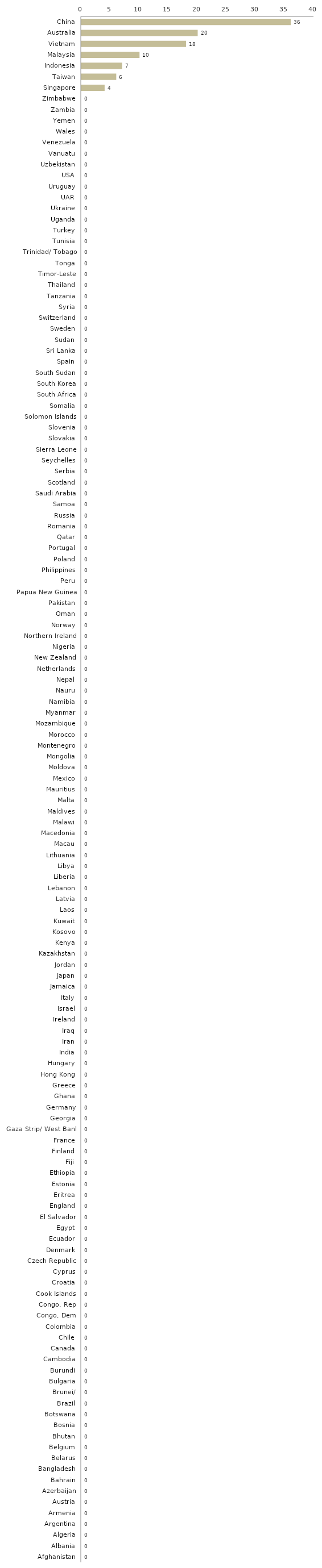
| Category | Series 0 |
|---|---|
| China | 36 |
| Australia | 20 |
| Vietnam | 18 |
| Malaysia | 10 |
| Indonesia | 7 |
| Taiwan | 6 |
| Singapore | 4 |
| Zimbabwe | 0 |
| Zambia | 0 |
| Yemen | 0 |
| Wales | 0 |
| Venezuela | 0 |
| Vanuatu | 0 |
| Uzbekistan | 0 |
| USA | 0 |
| Uruguay | 0 |
| UAR | 0 |
| Ukraine | 0 |
| Uganda | 0 |
| Turkey | 0 |
| Tunisia | 0 |
| Trinidad/ Tobago | 0 |
| Tonga | 0 |
| Timor-Leste | 0 |
| Thailand | 0 |
| Tanzania | 0 |
| Syria | 0 |
| Switzerland | 0 |
| Sweden | 0 |
| Sudan | 0 |
| Sri Lanka | 0 |
| Spain | 0 |
| South Sudan | 0 |
| South Korea | 0 |
| South Africa | 0 |
| Somalia | 0 |
| Solomon Islands | 0 |
| Slovenia | 0 |
| Slovakia | 0 |
| Sierra Leone | 0 |
| Seychelles | 0 |
| Serbia | 0 |
| Scotland | 0 |
| Saudi Arabia | 0 |
| Samoa | 0 |
| Russia | 0 |
| Romania | 0 |
| Qatar | 0 |
| Portugal | 0 |
| Poland | 0 |
| Philippines | 0 |
| Peru | 0 |
| Papua New Guinea | 0 |
| Pakistan | 0 |
| Oman | 0 |
| Norway | 0 |
| Northern Ireland | 0 |
| Nigeria | 0 |
| New Zealand | 0 |
| Netherlands | 0 |
| Nepal | 0 |
| Nauru | 0 |
| Namibia | 0 |
| Myanmar | 0 |
| Mozambique | 0 |
| Morocco | 0 |
| Montenegro | 0 |
| Mongolia | 0 |
| Moldova | 0 |
| Mexico | 0 |
| Mauritius | 0 |
| Malta | 0 |
| Maldives | 0 |
| Malawi | 0 |
| Macedonia | 0 |
| Macau | 0 |
| Lithuania | 0 |
| Libya | 0 |
| Liberia | 0 |
| Lebanon | 0 |
| Latvia | 0 |
| Laos | 0 |
| Kuwait | 0 |
| Kosovo | 0 |
| Kenya | 0 |
| Kazakhstan | 0 |
| Jordan | 0 |
| Japan | 0 |
| Jamaica | 0 |
| Italy | 0 |
| Israel | 0 |
| Ireland | 0 |
| Iraq | 0 |
| Iran | 0 |
| India | 0 |
| Hungary | 0 |
| Hong Kong | 0 |
| Greece | 0 |
| Ghana | 0 |
| Germany | 0 |
| Georgia | 0 |
| Gaza Strip/ West Bank | 0 |
| France | 0 |
| Finland | 0 |
| Fiji | 0 |
| Ethiopia | 0 |
| Estonia | 0 |
| Eritrea | 0 |
| England | 0 |
| El Salvador | 0 |
| Egypt | 0 |
| Ecuador | 0 |
| Denmark | 0 |
| Czech Republic | 0 |
| Cyprus | 0 |
| Croatia | 0 |
| Cook Islands | 0 |
| Congo, Rep | 0 |
| Congo, Dem | 0 |
| Colombia | 0 |
| Chile | 0 |
| Canada | 0 |
| Cambodia | 0 |
| Burundi | 0 |
| Bulgaria | 0 |
| Brunei/ | 0 |
| Brazil | 0 |
| Botswana | 0 |
| Bosnia | 0 |
| Bhutan | 0 |
| Belgium | 0 |
| Belarus | 0 |
| Bangladesh | 0 |
| Bahrain | 0 |
| Azerbaijan | 0 |
| Austria | 0 |
| Armenia | 0 |
| Argentina | 0 |
| Algeria | 0 |
| Albania | 0 |
| Afghanistan | 0 |